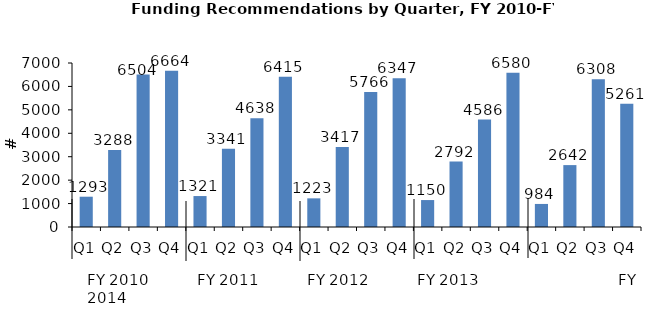
| Category | Result |
|---|---|
| Q1 | 1293 |
| Q2 | 3288 |
| Q3 | 6504 |
| Q4 | 6664 |
| Q1 | 1321 |
| Q2 | 3341 |
| Q3 | 4638 |
| Q4 | 6415 |
| Q1 | 1223 |
| Q2 | 3417 |
| Q3 | 5766 |
| Q4 | 6347 |
| Q1 | 1150 |
| Q2 | 2792 |
| Q3 | 4586 |
| Q4 | 6580 |
| Q1 | 984 |
| Q2 | 2642 |
| Q3 | 6308 |
| Q4 | 5261 |